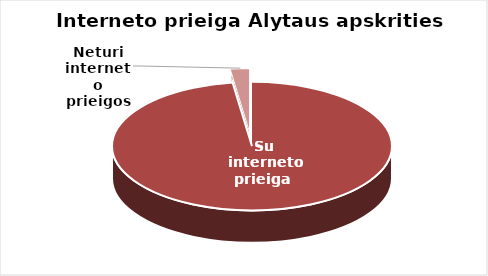
| Category | Series 0 |
|---|---|
| Su interneto prieiga  | 88 |
| Neturi interneto prieigos | 2 |